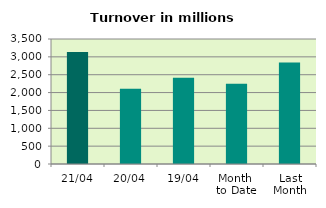
| Category | Series 0 |
|---|---|
| 21/04 | 3133.13 |
| 20/04 | 2107.037 |
| 19/04 | 2411.79 |
| Month 
to Date | 2249.235 |
| Last
Month | 2840.905 |